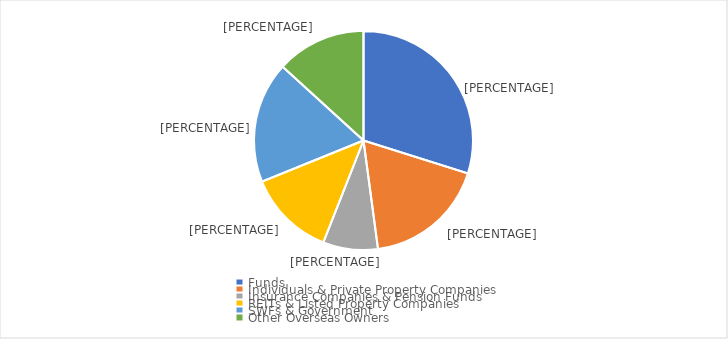
| Category | Series 0 |
|---|---|
| Funds | 0.299 |
| Individuals & Private Property Companies | 0.18 |
| Insurance Companies & Pension Funds | 0.081 |
| REITs & Listed Property Companies | 0.129 |
| SWFs & Government | 0.179 |
| Other Overseas Owners | 0.132 |